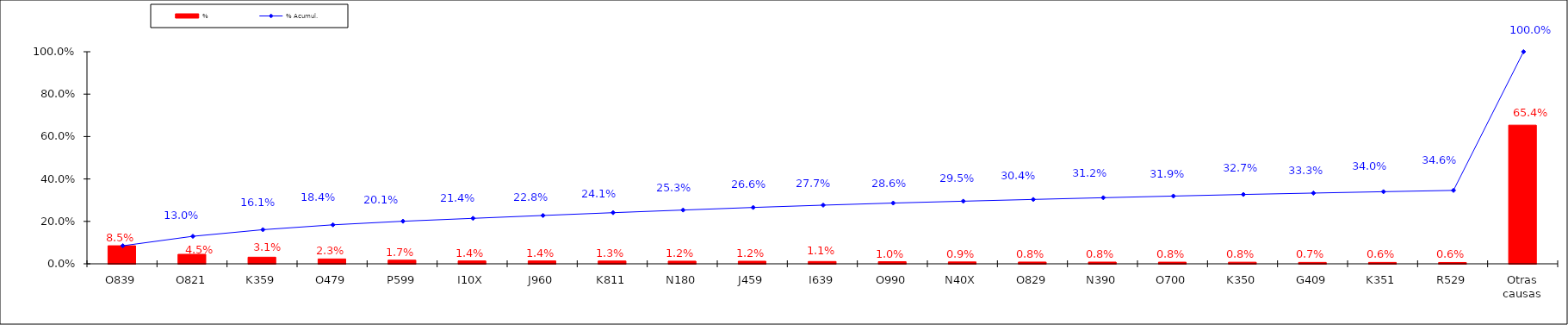
| Category | % |
|---|---|
| O839 | 0.085 |
| O821 | 0.045 |
| K359 | 0.031 |
| O479 | 0.023 |
| P599 | 0.017 |
| I10X | 0.014 |
| J960 | 0.014 |
| K811 | 0.013 |
| N180 | 0.012 |
| J459 | 0.012 |
| I639 | 0.011 |
| O990 | 0.01 |
| N40X | 0.009 |
| O829 | 0.008 |
| N390 | 0.008 |
| O700 | 0.008 |
| K350 | 0.008 |
| G409 | 0.007 |
| K351 | 0.006 |
| R529 | 0.006 |
| Otras causas | 0.654 |